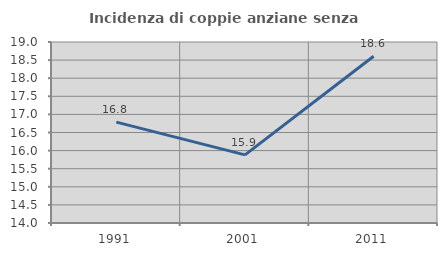
| Category | Incidenza di coppie anziane senza figli  |
|---|---|
| 1991.0 | 16.787 |
| 2001.0 | 15.881 |
| 2011.0 | 18.605 |